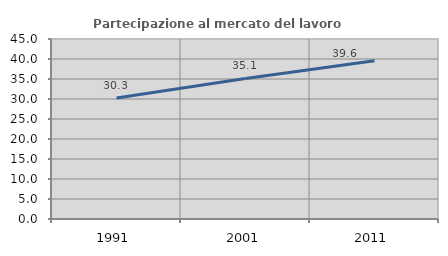
| Category | Partecipazione al mercato del lavoro  femminile |
|---|---|
| 1991.0 | 30.262 |
| 2001.0 | 35.125 |
| 2011.0 | 39.569 |